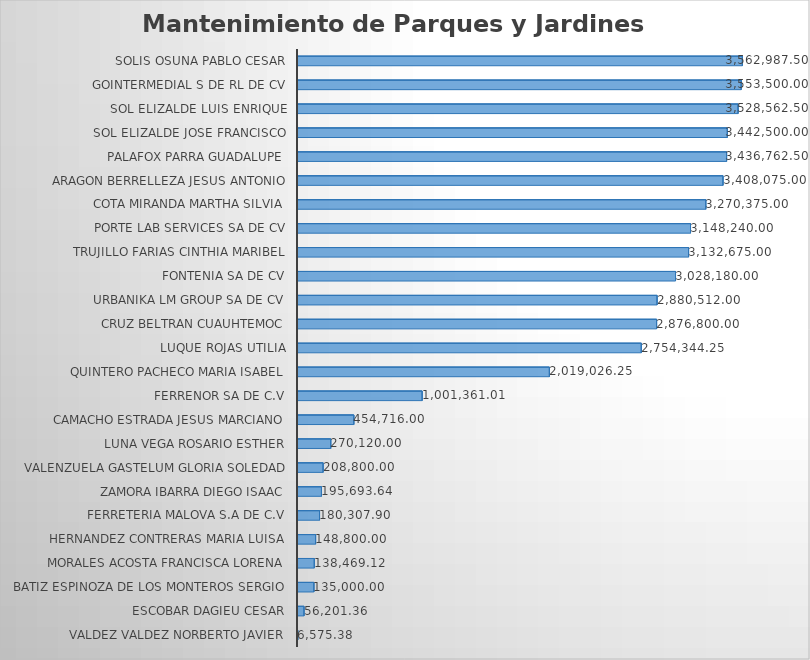
| Category | Suma |
|---|---|
| VALDEZ VALDEZ NORBERTO JAVIER | 6575.38 |
| ESCOBAR DAGIEU CESAR | 56201.36 |
| BATIZ ESPINOZA DE LOS MONTEROS SERGIO | 135000 |
| MORALES ACOSTA FRANCISCA LORENA | 138469.12 |
| HERNANDEZ CONTRERAS MARIA LUISA | 148800 |
| FERRETERIA MALOVA S.A DE C.V | 180307.9 |
| ZAMORA IBARRA DIEGO ISAAC | 195693.64 |
| VALENZUELA GASTELUM GLORIA SOLEDAD | 208800 |
| LUNA VEGA ROSARIO ESTHER | 270120 |
| CAMACHO ESTRADA JESUS MARCIANO | 454716 |
| FERRENOR SA DE C.V | 1001361.01 |
| QUINTERO PACHECO MARIA ISABEL | 2019026.25 |
| LUQUE ROJAS UTILIA | 2754344.25 |
| CRUZ BELTRAN CUAUHTEMOC | 2876800 |
| URBANIKA LM GROUP SA DE CV | 2880512 |
| FONTENIA SA DE CV | 3028180 |
| TRUJILLO FARIAS CINTHIA MARIBEL | 3132675 |
| PORTE LAB SERVICES SA DE CV | 3148240 |
| COTA MIRANDA MARTHA SILVIA | 3270375 |
| ARAGON BERRELLEZA JESUS ANTONIO | 3408075 |
| PALAFOX PARRA GUADALUPE | 3436762.5 |
| SOL ELIZALDE JOSE FRANCISCO | 3442500 |
| SOL ELIZALDE LUIS ENRIQUE | 3528562.5 |
| GOINTERMEDIAL S DE RL DE CV | 3553500 |
| SOLIS OSUNA PABLO CESAR | 3562987.5 |